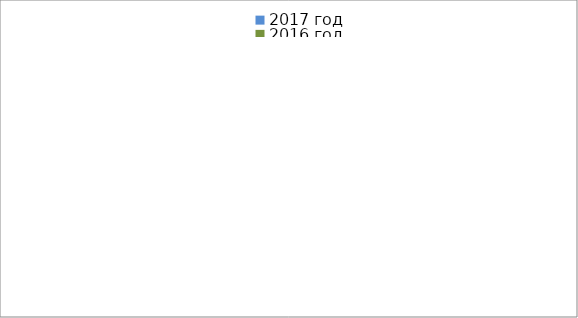
| Category | 2017 год | 2016 год |
|---|---|---|
|  - поджог | 3 | 21 |
|  - неосторожное обращение с огнём | 2 | 14 |
|  - НПТЭ электрооборудования | 5 | 2 |
|  - НПУ и Э печей | 19 | 19 |
|  - НПУ и Э транспортных средств | 31 | 9 |
|   -Шалость с огнем детей | 3 | 4 |
|  -НППБ при эксплуатации эл.приборов | 13 | 4 |
|  - курение | 16 | 3 |
| - прочие | 31 | 42 |
| - не установленные причины | 0 | 11 |